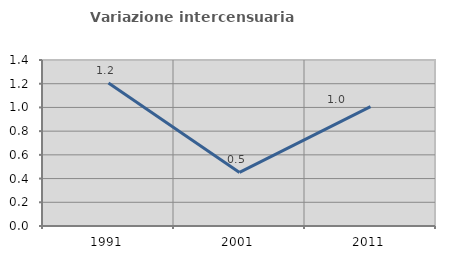
| Category | Variazione intercensuaria annua |
|---|---|
| 1991.0 | 1.206 |
| 2001.0 | 0.452 |
| 2011.0 | 1.007 |